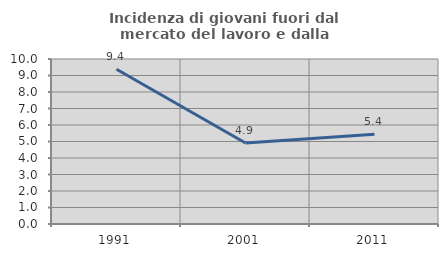
| Category | Incidenza di giovani fuori dal mercato del lavoro e dalla formazione  |
|---|---|
| 1991.0 | 9.382 |
| 2001.0 | 4.907 |
| 2011.0 | 5.435 |